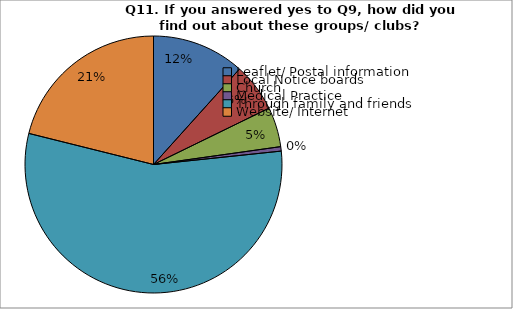
| Category | Series 0 |
|---|---|
| Leaflet/ Postal information | 21 |
| Local Notice boards | 11 |
| Church | 9 |
| Medical Practice | 1 |
| Through family and friends | 100 |
| Website/ Internet | 38 |